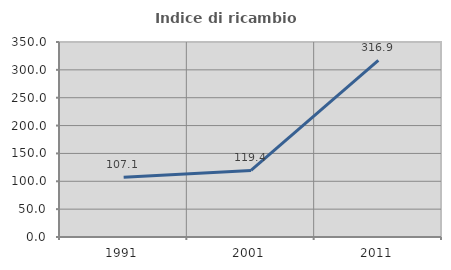
| Category | Indice di ricambio occupazionale  |
|---|---|
| 1991.0 | 107.071 |
| 2001.0 | 119.444 |
| 2011.0 | 316.949 |